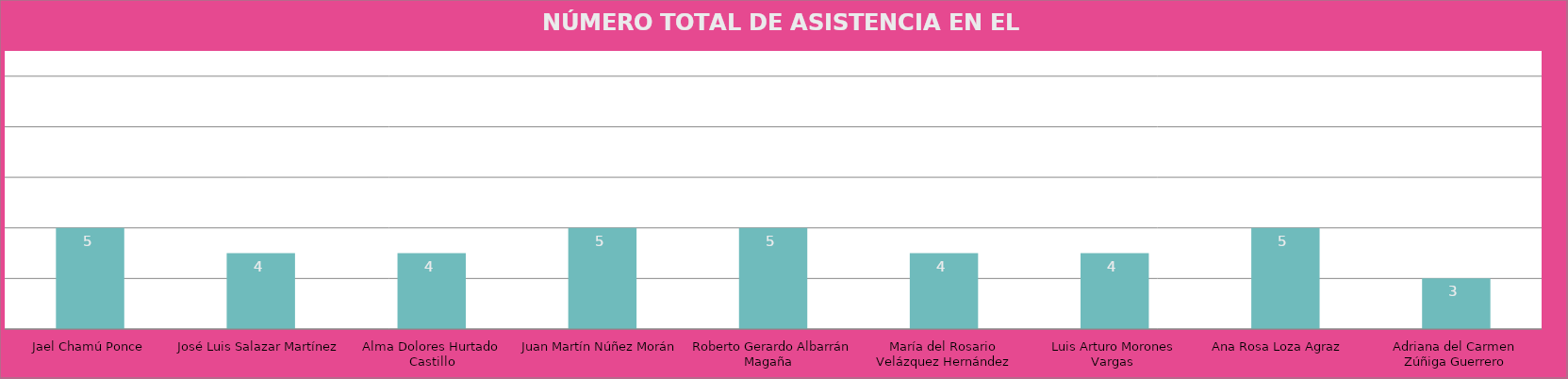
| Category | Series 0 |
|---|---|
| Jael Chamú Ponce | 5 |
| José Luis Salazar Martínez  | 4 |
| Alma Dolores Hurtado Castillo | 4 |
| Juan Martín Núñez Morán | 5 |
| Roberto Gerardo Albarrán Magaña   | 5 |
| María del Rosario Velázquez Hernández | 4 |
| Luis Arturo Morones Vargas  | 4 |
| Ana Rosa Loza Agraz    | 5 |
| Adriana del Carmen Zúñiga Guerrero | 3 |